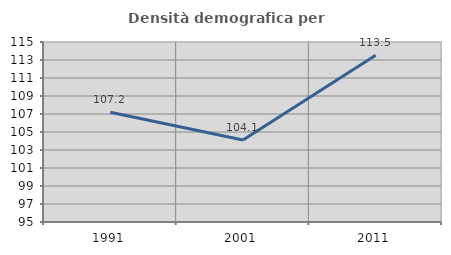
| Category | Densità demografica |
|---|---|
| 1991.0 | 107.198 |
| 2001.0 | 104.108 |
| 2011.0 | 113.519 |